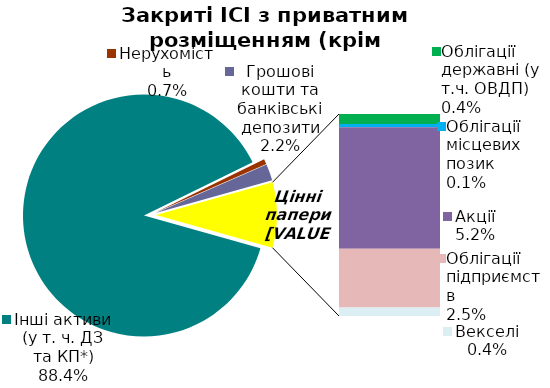
| Category | Series 0 |
|---|---|
| Інші активи (у т. ч. ДЗ та КП*) | 0.884 |
| Нерухомість | 0.007 |
| Грошові кошти та банківські депозити | 0.022 |
| Банківські метали | 0 |
| Облігації державні (у т.ч. ОВДП) | 0.004 |
| Облігації місцевих позик | 0.001 |
| Акції | 0.052 |
| Облігації підприємств | 0.025 |
| Векселі | 0.004 |